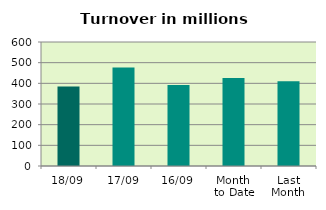
| Category | Series 0 |
|---|---|
| 18/09 | 384.669 |
| 17/09 | 476.192 |
| 16/09 | 392.123 |
| Month 
to Date | 426.203 |
| Last
Month | 410.207 |